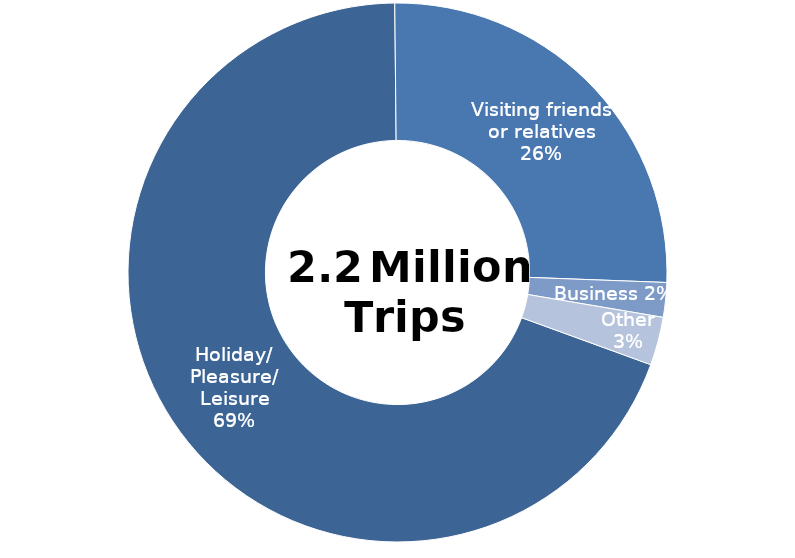
| Category | Series 0 |
|---|---|
| Holiday/ Pleasure/ Leisure | 1519653.421 |
| Visiting friends or relatives | 564881.844 |
| Business | 45498.427 |
| Other | 63394.713 |